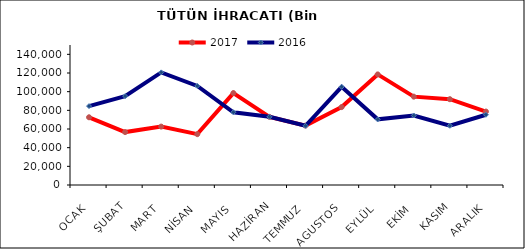
| Category | 2017 | 2016 |
|---|---|---|
| OCAK | 72553.879 | 84511.731 |
| ŞUBAT | 56698.544 | 95207.149 |
| MART | 62550.802 | 120666.016 |
| NİSAN | 54475.133 | 106168.637 |
| MAYIS | 98506.515 | 77918.444 |
| HAZİRAN | 72979.067 | 73102.883 |
| TEMMUZ | 63649.259 | 63427.969 |
| AGUSTOS | 83484.789 | 105204.745 |
| EYLÜL | 118488.165 | 70332.889 |
| EKİM | 94654.499 | 74471.286 |
| KASIM | 91939.849 | 63456.79 |
| ARALIK | 78684.854 | 75289.752 |